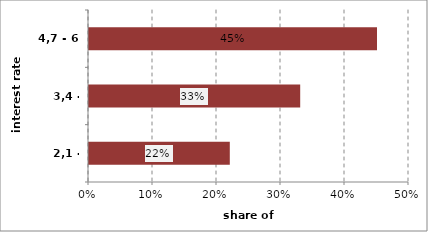
| Category | Series 0 |
|---|---|
| 2,1 - 3,4 | 0.22 |
| 3,4 - 4,7 | 0.33 |
| 4,7 - 6 | 0.45 |